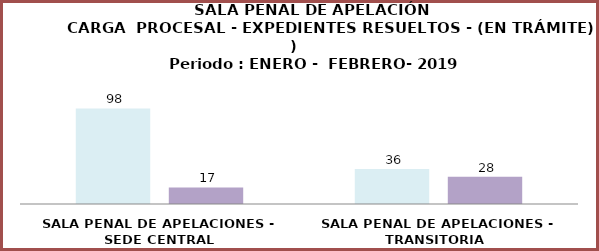
| Category | Series 0 | Series 1 |
|---|---|---|
| SALA PENAL DE APELACIONES - SEDE CENTRAL | 98 | 17 |
| SALA PENAL DE APELACIONES - TRANSITORIA  | 36 | 28 |